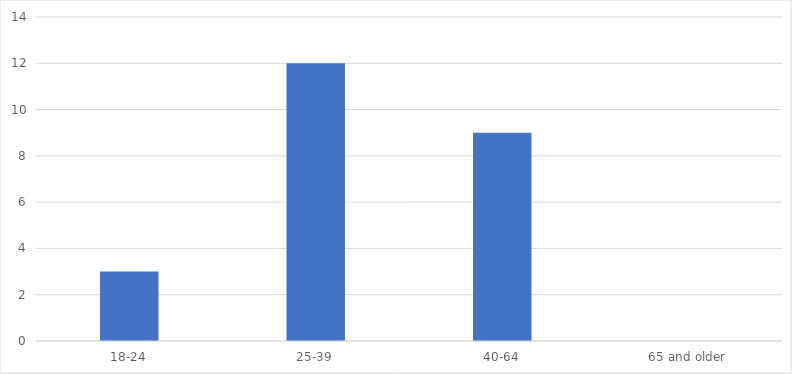
| Category | Number of Responses |
|---|---|
| 18-24 | 3 |
| 25-39 | 12 |
| 40-64 | 9 |
| 65 and older | 0 |